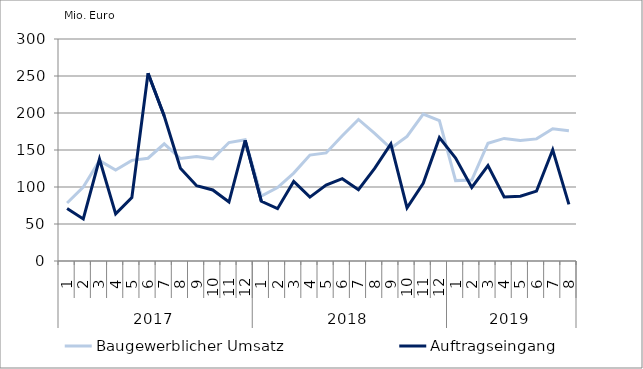
| Category | Baugewerblicher Umsatz | Auftragseingang |
|---|---|---|
| 0 | 78446.78 | 70908.903 |
| 1 | 99841.908 | 56868.408 |
| 2 | 135679.867 | 137790.423 |
| 3 | 123004.403 | 63637.761 |
| 4 | 136010.071 | 85644.63 |
| 5 | 138859.308 | 253791.552 |
| 6 | 158353.879 | 196034.198 |
| 7 | 138510.315 | 125319.873 |
| 8 | 141109.925 | 101690.626 |
| 9 | 138067.098 | 95966.626 |
| 10 | 160064.454 | 79701.993 |
| 11 | 163969.017 | 162878.607 |
| 12 | 87640.529 | 80684.627 |
| 13 | 99259.455 | 70746.763 |
| 14 | 118764.324 | 107538.747 |
| 15 | 143144.178 | 86374.619 |
| 16 | 146070.782 | 102661.329 |
| 17 | 169150.753 | 111287.709 |
| 18 | 191277.885 | 96286.662 |
| 19 | 172425.535 | 125142.495 |
| 20 | 152354.98 | 158112.302 |
| 21 | 168372.756 | 71808.619 |
| 22 | 198558.472 | 104904.147 |
| 23 | 189665.914 | 166653.461 |
| 24 | 108616.605 | 139065.287 |
| 25 | 109331.58 | 99318.609 |
| 26 | 159117.81 | 129002.041 |
| 27 | 165654.287 | 86579.2 |
| 28 | 162976.056 | 87644.362 |
| 29 | 165026.188 | 94463.186 |
| 30 | 178622.938 | 150345.08 |
| 31 | 176074.101 | 76434.317 |